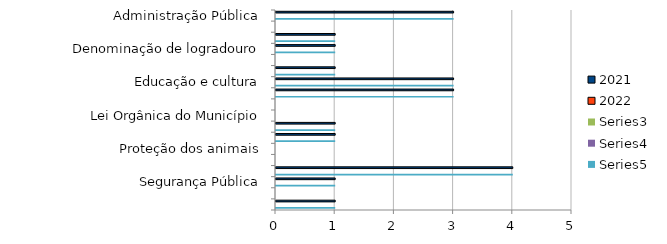
| Category | 2021 | 2022 | Series 2 | Series 3 | Series 4 |
|---|---|---|---|---|---|
| Administração Pública | 3 |  |  |  | 3 |
| Combate à corrupção  | 0 |  |  |  | 0 |
| Datas comemorativas e homenagens diversas | 1 |  |  |  | 1 |
| Denominação de logradouro | 1 |  |  |  | 1 |
| Desenvolvimento Econômico | 0 |  |  |  | 0 |
| Desenvolvimento Social  | 1 |  |  |  | 1 |
| Educação e cultura | 3 |  |  |  | 3 |
| Frente parlamentar | 3 |  |  |  | 3 |
| Habitação e Urbanismo | 0 |  |  |  | 0 |
| Lei Orgânica do Município | 0 |  |  |  | 0 |
| Meio ambiente  | 1 |  |  |  | 1 |
| Mobilidade | 1 |  |  |  | 1 |
| Proteção dos animais | 0 |  |  |  | 0 |
| Regimento Interno da CMSP | 0 |  |  |  | 0 |
| Saude-Esporte | 4 |  |  |  | 4 |
| Segurança Pública | 1 |  |  |  | 1 |
| Transparencia | 0 |  |  |  | 0 |
| Tributação | 1 |  |  |  | 1 |